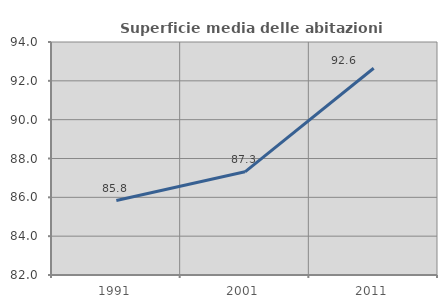
| Category | Superficie media delle abitazioni occupate |
|---|---|
| 1991.0 | 85.834 |
| 2001.0 | 87.314 |
| 2011.0 | 92.647 |